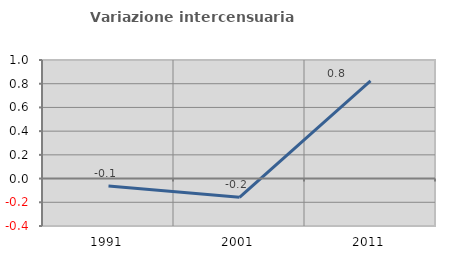
| Category | Variazione intercensuaria annua |
|---|---|
| 1991.0 | -0.063 |
| 2001.0 | -0.158 |
| 2011.0 | 0.823 |